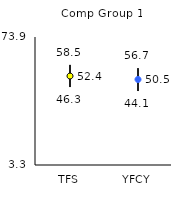
| Category | 25th | 75th | Mean |
|---|---|---|---|
| TFS | 46.3 | 58.5 | 52.37 |
| YFCY | 44.1 | 56.7 | 50.48 |